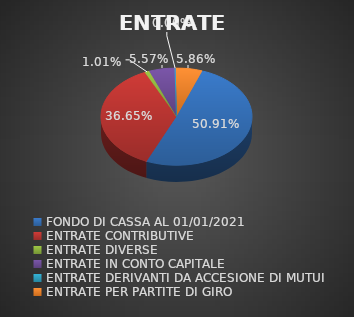
| Category | ENTRATE |
|---|---|
| FONDO DI CASSA AL 01/01/2021 | 0.509 |
| ENTRATE CONTRIBUTIVE | 0.366 |
| ENTRATE DIVERSE | 0.01 |
| ENTRATE IN CONTO CAPITALE | 0.056 |
| ENTRATE DERIVANTI DA ACCESIONE DI MUTUI | 0 |
| ENTRATE PER PARTITE DI GIRO | 0.059 |